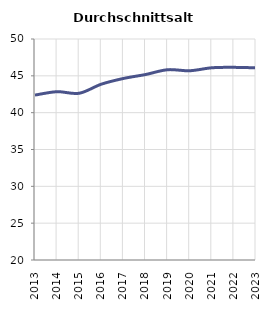
| Category | Durchschnittsalter |
|---|---|
| 2013.0 | 42.386 |
| 2014.0 | 42.848 |
| 2015.0 | 42.635 |
| 2016.0 | 43.865 |
| 2017.0 | 44.641 |
| 2018.0 | 45.175 |
| 2019.0 | 45.83 |
| 2020.0 | 45.69 |
| 2021.0 | 46.093 |
| 2022.0 | 46.15 |
| 2023.0 | 46.087 |